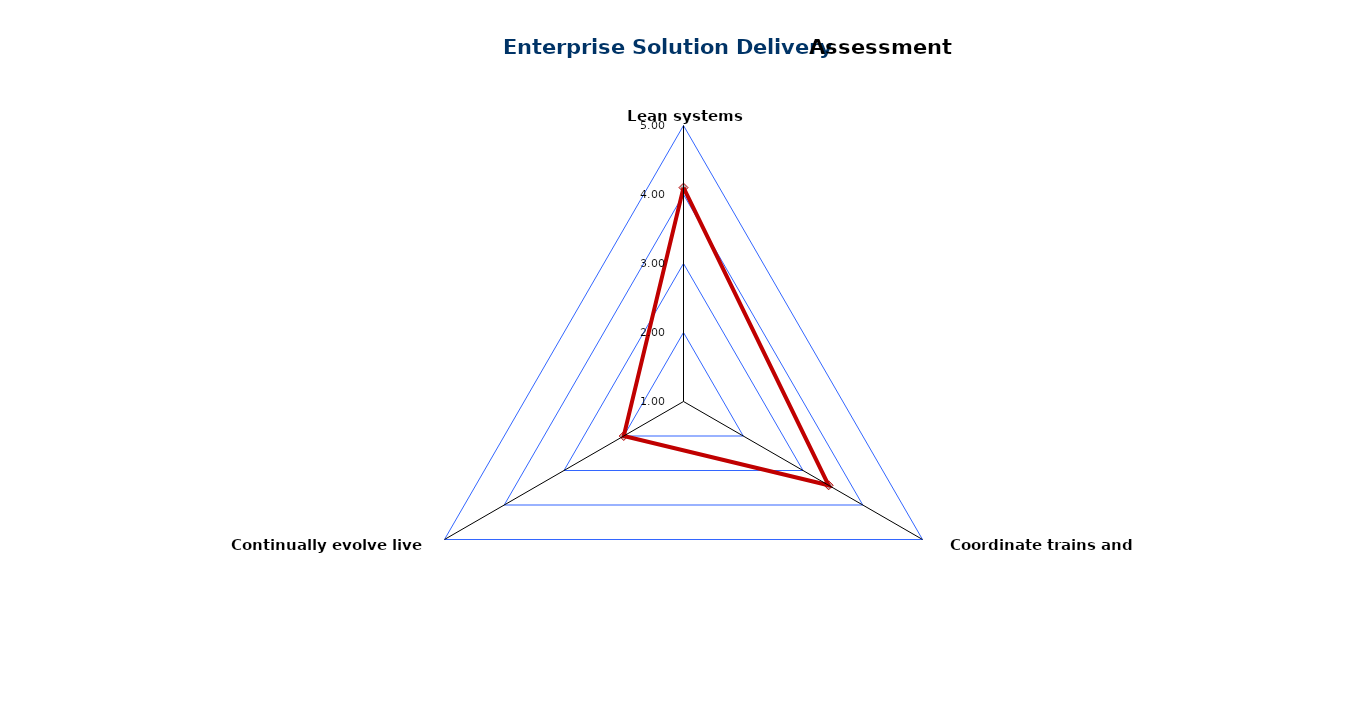
| Category | Enterprise Solution Delivery |
|---|---|
| Lean systems engineering  | 4.1 |
| Coordinate trains and suppliers | 3.429 |
| Continually evolve live systems | 2 |